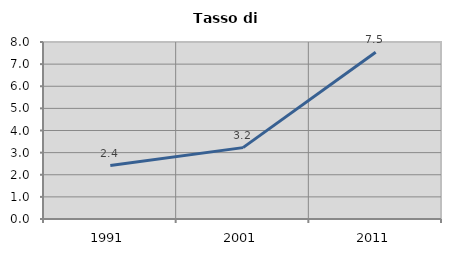
| Category | Tasso di disoccupazione   |
|---|---|
| 1991.0 | 2.417 |
| 2001.0 | 3.226 |
| 2011.0 | 7.533 |